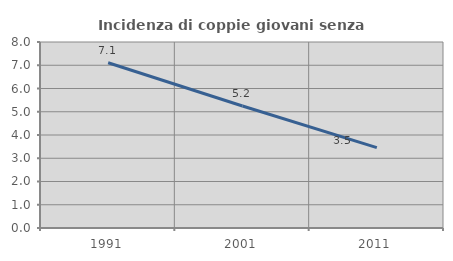
| Category | Incidenza di coppie giovani senza figli |
|---|---|
| 1991.0 | 7.105 |
| 2001.0 | 5.246 |
| 2011.0 | 3.455 |